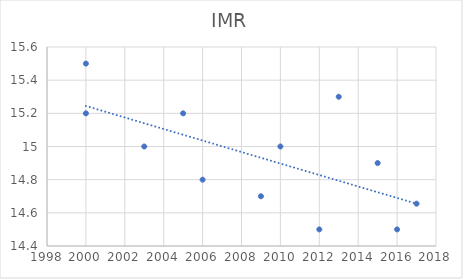
| Category | IMR |
|---|---|
| 2000.0 | 15.5 |
| 2000.0 | 15.2 |
| 2003.0 | 15 |
| 2005.0 | 15.2 |
| 2006.0 | 14.8 |
| 2009.0 | 14.7 |
| 2010.0 | 15 |
| 2012.0 | 14.5 |
| 2013.0 | 15.3 |
| 2015.0 | 14.9 |
| 2016.0 | 14.5 |
| 2017.0 | 14.655 |